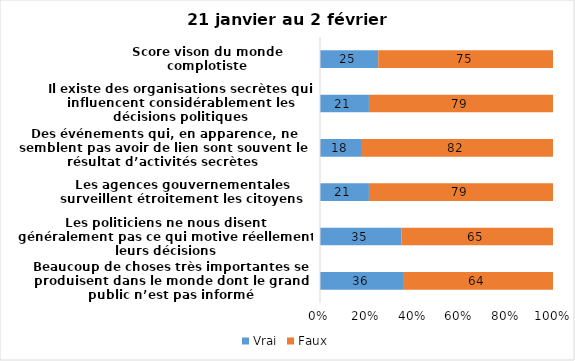
| Category | Vrai | Faux |
|---|---|---|
| Beaucoup de choses très importantes se produisent dans le monde dont le grand public n’est pas informé | 36 | 64 |
| Les politiciens ne nous disent généralement pas ce qui motive réellement leurs décisions | 35 | 65 |
| Les agences gouvernementales surveillent étroitement les citoyens | 21 | 79 |
| Des événements qui, en apparence, ne semblent pas avoir de lien sont souvent le résultat d’activités secrètes | 18 | 82 |
| Il existe des organisations secrètes qui influencent considérablement les décisions politiques | 21 | 79 |
| Score vison du monde complotiste | 25 | 75 |